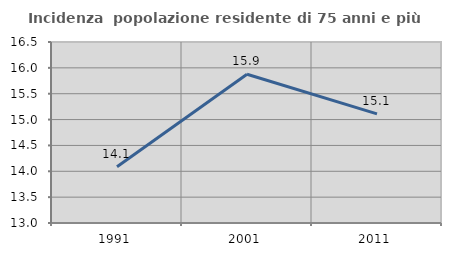
| Category | Incidenza  popolazione residente di 75 anni e più |
|---|---|
| 1991.0 | 14.087 |
| 2001.0 | 15.876 |
| 2011.0 | 15.109 |